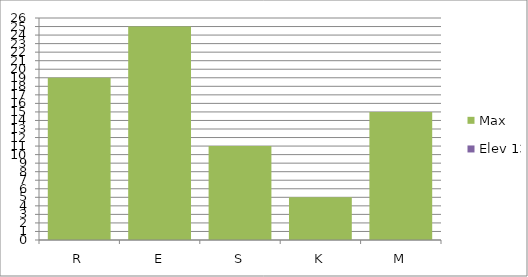
| Category | Max | Elev 13 |
|---|---|---|
| R | 19 | 0 |
| E | 25 | 0 |
| S | 11 | 0 |
| K | 5 | 0 |
| M | 15 | 0 |